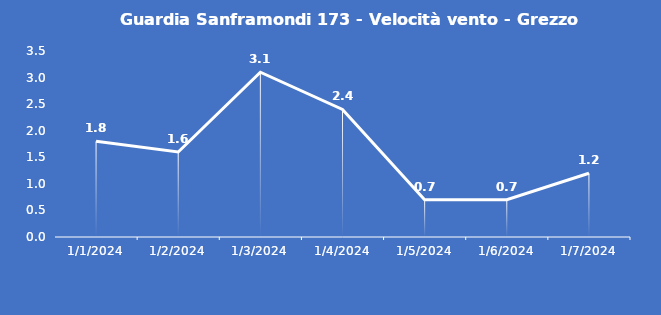
| Category | Guardia Sanframondi 173 - Velocità vento - Grezzo (m/s) |
|---|---|
| 1/1/24 | 1.8 |
| 1/2/24 | 1.6 |
| 1/3/24 | 3.1 |
| 1/4/24 | 2.4 |
| 1/5/24 | 0.7 |
| 1/6/24 | 0.7 |
| 1/7/24 | 1.2 |